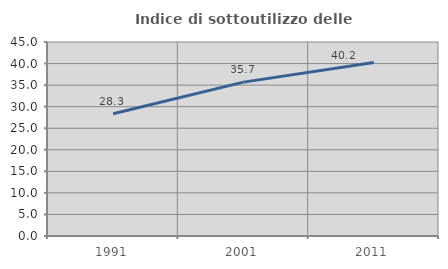
| Category | Indice di sottoutilizzo delle abitazioni  |
|---|---|
| 1991.0 | 28.34 |
| 2001.0 | 35.695 |
| 2011.0 | 40.246 |